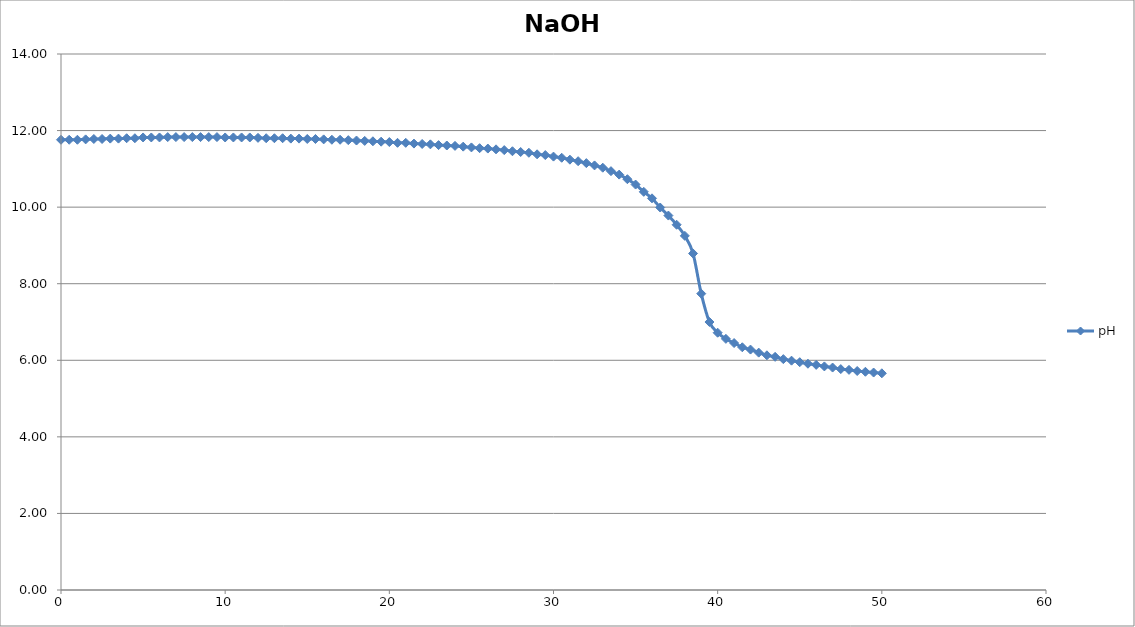
| Category | pH |
|---|---|
| 0.0 | 11.76 |
| 0.5 | 11.76 |
| 1.0 | 11.76 |
| 1.5 | 11.77 |
| 2.0 | 11.78 |
| 2.5 | 11.78 |
| 3.0 | 11.79 |
| 3.5 | 11.79 |
| 4.0 | 11.8 |
| 4.5 | 11.8 |
| 5.0 | 11.82 |
| 5.5 | 11.82 |
| 6.0 | 11.82 |
| 6.5 | 11.83 |
| 7.0 | 11.83 |
| 7.5 | 11.83 |
| 8.0 | 11.83 |
| 8.5 | 11.83 |
| 9.0 | 11.83 |
| 9.5 | 11.83 |
| 10.0 | 11.82 |
| 10.5 | 11.82 |
| 11.0 | 11.82 |
| 11.5 | 11.82 |
| 12.0 | 11.81 |
| 12.5 | 11.8 |
| 13.0 | 11.8 |
| 13.5 | 11.8 |
| 14.0 | 11.79 |
| 14.5 | 11.79 |
| 15.0 | 11.78 |
| 15.5 | 11.78 |
| 16.0 | 11.77 |
| 16.5 | 11.76 |
| 17.0 | 11.76 |
| 17.5 | 11.75 |
| 18.0 | 11.74 |
| 18.5 | 11.73 |
| 19.0 | 11.72 |
| 19.5 | 11.71 |
| 20.0 | 11.7 |
| 20.5 | 11.68 |
| 21.0 | 11.68 |
| 21.5 | 11.66 |
| 22.0 | 11.65 |
| 22.5 | 11.64 |
| 23.0 | 11.62 |
| 23.5 | 11.61 |
| 24.0 | 11.6 |
| 24.5 | 11.58 |
| 25.0 | 11.56 |
| 25.5 | 11.54 |
| 26.0 | 11.53 |
| 26.5 | 11.51 |
| 27.0 | 11.49 |
| 27.5 | 11.46 |
| 28.0 | 11.44 |
| 28.5 | 11.42 |
| 29.0 | 11.38 |
| 29.5 | 11.36 |
| 30.0 | 11.32 |
| 30.5 | 11.29 |
| 31.0 | 11.24 |
| 31.5 | 11.2 |
| 32.0 | 11.15 |
| 32.5 | 11.09 |
| 33.0 | 11.03 |
| 33.5 | 10.94 |
| 34.0 | 10.85 |
| 34.5 | 10.73 |
| 35.0 | 10.59 |
| 35.5 | 10.4 |
| 36.0 | 10.23 |
| 36.5 | 9.99 |
| 37.0 | 9.78 |
| 37.5 | 9.54 |
| 38.0 | 9.25 |
| 38.5 | 8.79 |
| 39.0 | 7.74 |
| 39.5 | 7 |
| 40.0 | 6.72 |
| 40.5 | 6.56 |
| 41.0 | 6.45 |
| 41.5 | 6.34 |
| 42.0 | 6.28 |
| 42.5 | 6.2 |
| 43.0 | 6.13 |
| 43.5 | 6.09 |
| 44.0 | 6.03 |
| 44.5 | 5.99 |
| 45.0 | 5.95 |
| 45.5 | 5.91 |
| 46.0 | 5.88 |
| 46.5 | 5.84 |
| 47.0 | 5.81 |
| 47.5 | 5.77 |
| 48.0 | 5.75 |
| 48.5 | 5.72 |
| 49.0 | 5.7 |
| 49.5 | 5.68 |
| 50.0 | 5.66 |